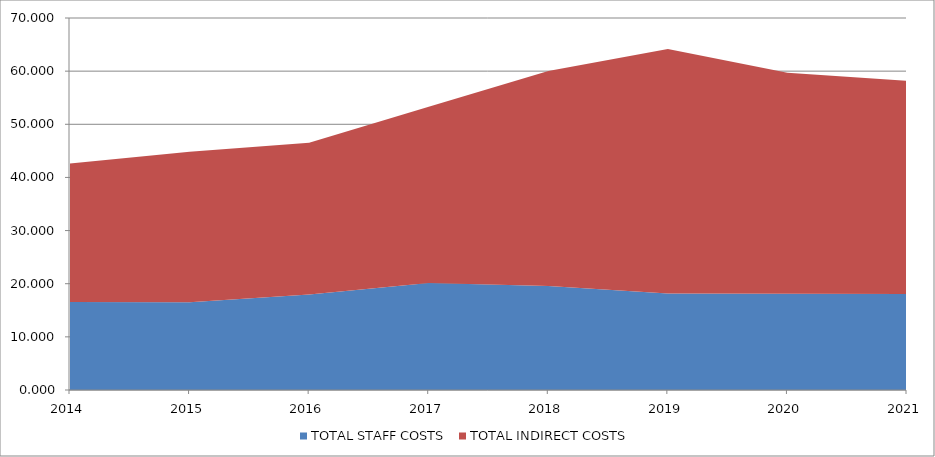
| Category | TOTAL STAFF COSTS | TOTAL INDIRECT COSTS |
|---|---|---|
| 2014.0 | 16.567 | 26.045 |
| 2015.0 | 16.497 | 28.353 |
| 2016.0 | 17.971 | 28.566 |
| 2017.0 | 20.156 | 33.135 |
| 2018.0 | 19.553 | 40.469 |
| 2019.0 | 18.166 | 46.003 |
| 2020.0 | 18.115 | 41.586 |
| 2021.0 | 18.065 | 40.129 |